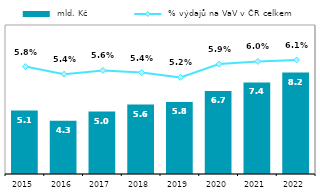
| Category |  mld. Kč |
|---|---|
| 2015.0 | 5.112 |
| 2016.0 | 4.295 |
| 2017.0 | 5.024 |
| 2018.0 | 5.594 |
| 2019.0 | 5.791 |
| 2020.0 | 6.691 |
| 2021.0 | 7.372 |
| 2022.0 | 8.164 |